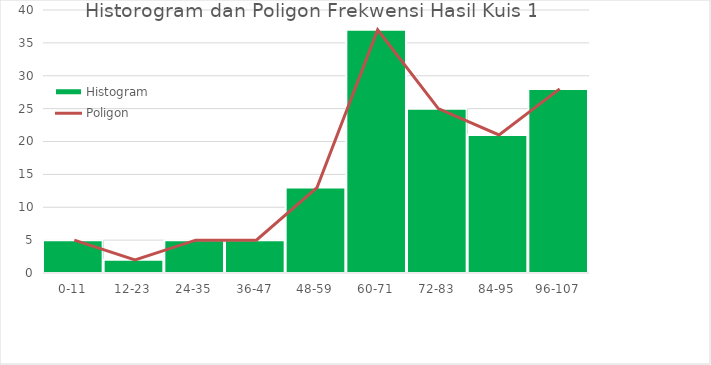
| Category | Histogram |
|---|---|
| 0-11 | 5 |
| 12-23 | 2 |
| 24-35 | 5 |
| 36-47 | 5 |
| 48-59 | 13 |
| 60-71 | 37 |
| 72-83 | 25 |
| 84-95 | 21 |
| 96-107 | 28 |